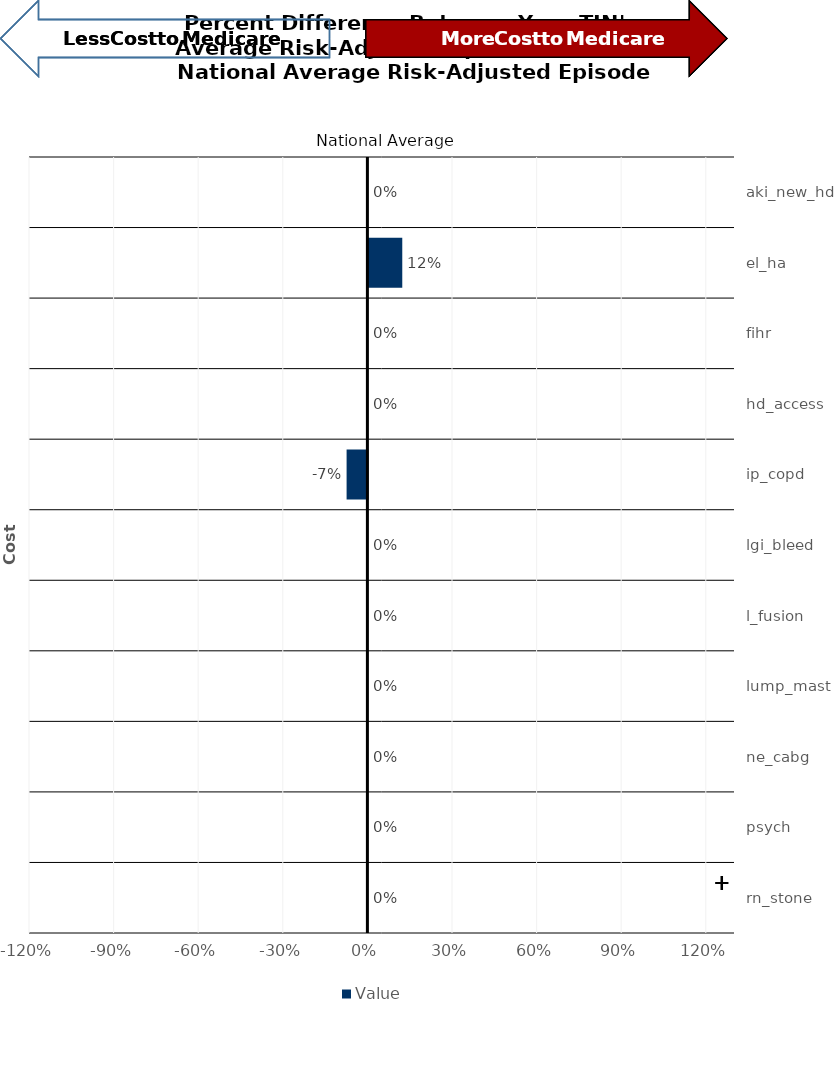
| Category | Value |
|---|---|
| aki_new_hd | 0 |
| el_ha | 0.12 |
| fihr | 0 |
| hd_access | 0 |
| ip_copd | -0.074 |
| lgi_bleed | 0 |
| l_fusion | 0 |
| lump_mast | 0 |
| ne_cabg | 0 |
| psych | 0 |
| rn_stone | 0 |